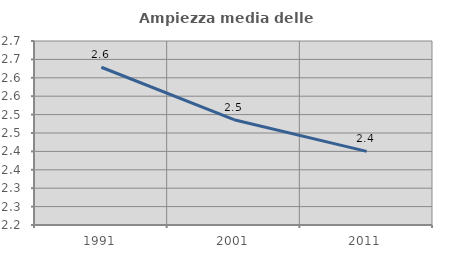
| Category | Ampiezza media delle famiglie |
|---|---|
| 1991.0 | 2.629 |
| 2001.0 | 2.486 |
| 2011.0 | 2.4 |